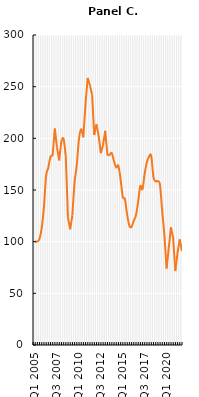
| Category | Series 1 |
|---|---|
| Q1 2005 | 100 |
| Q2 2005 | 100.21 |
| Q3 2005 | 102.735 |
| Q4 2005 | 112.973 |
| Q1 2006 | 132.819 |
| Q2 2006 | 163.394 |
| Q3 2006 | 171.459 |
| Q4 2006 | 181.978 |
| Q1 2007 | 183.17 |
| Q2 2007 | 209.537 |
| Q3 2007 | 191.024 |
| Q4 2007 | 178.612 |
| Q1 2008 | 197.686 |
| Q2 2008 | 199.509 |
| Q3 2008 | 182.679 |
| Q4 2008 | 123.072 |
| Q1 2009 | 111.992 |
| Q2 2009 | 125.386 |
| Q3 2009 | 156.872 |
| Q4 2009 | 173.633 |
| Q1 2010 | 198.738 |
| Q2 2010 | 208.766 |
| Q3 2010 | 200.982 |
| Q4 2010 | 233.17 |
| Q1 2011 | 258.485 |
| Q2 2011 | 251.403 |
| Q3 2011 | 242.356 |
| Q4 2011 | 203.226 |
| Q1 2012 | 213.604 |
| Q2 2012 | 201.964 |
| Q3 2012 | 185.624 |
| Q4 2012 | 193.548 |
| Q1 2013 | 207.293 |
| Q2 2013 | 183.59 |
| Q3 2013 | 184.081 |
| Q4 2013 | 185.694 |
| Q1 2014 | 177.91 |
| Q2 2014 | 171.879 |
| Q3 2014 | 173.422 |
| Q4 2014 | 160.519 |
| Q1 2015 | 143.478 |
| Q2 2015 | 140.954 |
| Q3 2015 | 126.297 |
| Q4 2015 | 115.638 |
| Q1 2016 | 114.236 |
| Q2 2016 | 120.126 |
| Q3 2016 | 125.386 |
| Q4 2016 | 138.219 |
| Q1 2017 | 153.787 |
| Q2 2017 | 150.755 |
| Q3 2017 | 165.668 |
| Q4 2017 | 176.928 |
| Q1 2018 | 182.314 |
| Q2 2018 | 182.977 |
| Q3 2018 | 162.565 |
| Q4 2018 | 158.416 |
| Q1 2019 | 158.602 |
| Q2 2019 | 154.884 |
| Q3 2019 | 129.686 |
| Q4 2019 | 106.391 |
| Q1 2020 | 73.946 |
| Q2 2020 | 93.783 |
| Q3 2020 | 113.987 |
| Q4 2020 | 103.433 |
| 01/01/2021 | 71.524 |
| 01/02/2021 | 88.904 |
| 01/03/2021 | 102.261 |
| 01/08/2021 | 90.896 |